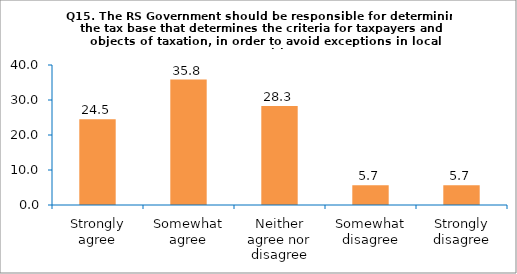
| Category | Series 0 |
|---|---|
| Strongly agree | 24.528 |
| Somewhat agree | 35.849 |
| Neither agree nor disagree | 28.302 |
| Somewhat disagree | 5.66 |
| Strongly disagree | 5.66 |